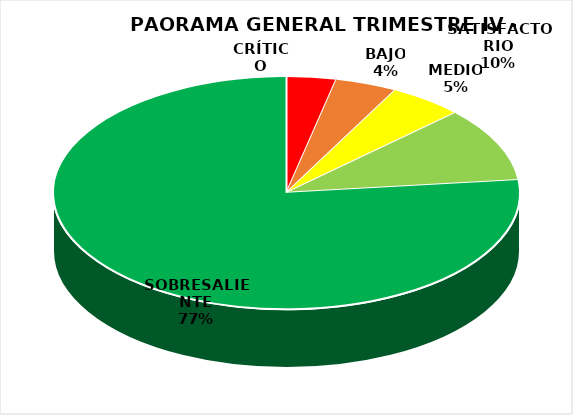
| Category | Series 0 |
|---|---|
| CRÍTICO | 4 |
| BAJO | 5 |
| MEDIO | 6 |
| SATISFACTORIO | 12 |
| SOBRESALIENTE | 89 |